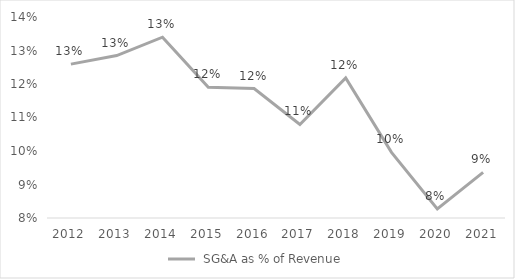
| Category | Series 2 |
|---|---|
| 2012.0 | 0.126 |
| 2013.0 | 0.128 |
| 2014.0 | 0.134 |
| 2015.0 | 0.119 |
| 2016.0 | 0.119 |
| 2017.0 | 0.108 |
| 2018.0 | 0.122 |
| 2019.0 | 0.1 |
| 2020.0 | 0.083 |
| 2021.0 | 0.094 |